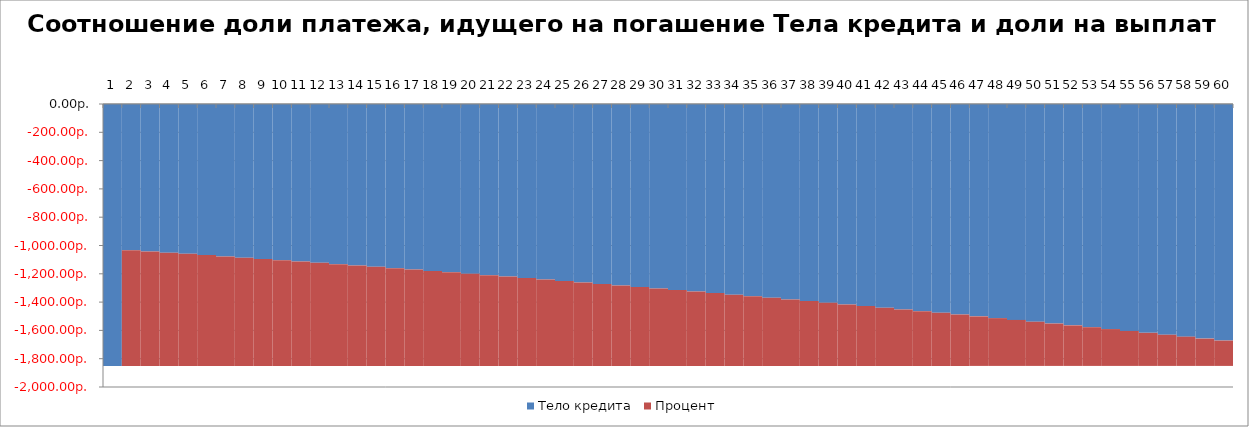
| Category | Тело кредита | Процент |
|---|---|---|
| 0 | -1851.005 | 0 |
| 1 | -1033.097 | -817.908 |
| 2 | -1041.706 | -809.299 |
| 3 | -1050.387 | -800.618 |
| 4 | -1059.14 | -791.865 |
| 5 | -1067.966 | -783.039 |
| 6 | -1076.866 | -774.139 |
| 7 | -1085.84 | -765.165 |
| 8 | -1094.889 | -756.117 |
| 9 | -1104.013 | -746.993 |
| 10 | -1113.213 | -737.792 |
| 11 | -1122.49 | -728.516 |
| 12 | -1131.844 | -719.162 |
| 13 | -1141.276 | -709.73 |
| 14 | -1150.786 | -700.219 |
| 15 | -1160.376 | -690.629 |
| 16 | -1170.046 | -680.959 |
| 17 | -1179.796 | -671.209 |
| 18 | -1189.628 | -661.377 |
| 19 | -1199.542 | -651.464 |
| 20 | -1209.538 | -641.467 |
| 21 | -1219.617 | -631.388 |
| 22 | -1229.781 | -621.225 |
| 23 | -1240.029 | -610.976 |
| 24 | -1250.362 | -600.643 |
| 25 | -1260.782 | -590.223 |
| 26 | -1271.289 | -579.717 |
| 27 | -1281.883 | -569.122 |
| 28 | -1292.565 | -558.44 |
| 29 | -1303.336 | -547.669 |
| 30 | -1314.198 | -536.808 |
| 31 | -1325.149 | -525.856 |
| 32 | -1336.192 | -514.813 |
| 33 | -1347.327 | -503.678 |
| 34 | -1358.555 | -492.45 |
| 35 | -1369.876 | -481.129 |
| 36 | -1381.292 | -469.713 |
| 37 | -1392.802 | -458.203 |
| 38 | -1404.409 | -446.596 |
| 39 | -1416.113 | -434.893 |
| 40 | -1427.914 | -423.092 |
| 41 | -1439.813 | -411.192 |
| 42 | -1451.811 | -399.194 |
| 43 | -1463.91 | -387.096 |
| 44 | -1476.109 | -374.896 |
| 45 | -1488.41 | -362.595 |
| 46 | -1500.813 | -350.192 |
| 47 | -1513.32 | -337.685 |
| 48 | -1525.931 | -325.074 |
| 49 | -1538.647 | -312.358 |
| 50 | -1551.469 | -299.536 |
| 51 | -1564.398 | -286.607 |
| 52 | -1577.435 | -273.57 |
| 53 | -1590.58 | -260.425 |
| 54 | -1603.835 | -247.17 |
| 55 | -1617.2 | -233.805 |
| 56 | -1630.677 | -220.328 |
| 57 | -1644.266 | -206.739 |
| 58 | -1657.968 | -193.037 |
| 59 | -1671.784 | -179.221 |